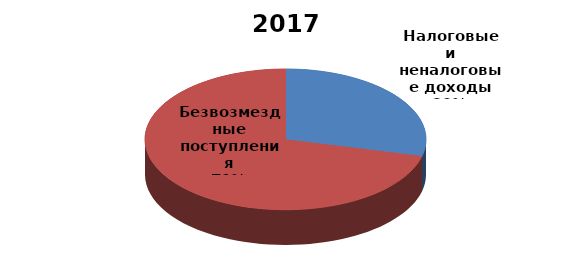
| Category | 2017 год |
|---|---|
| Налоговые и неналоговые доходы | 443642.8 |
| Безвозмездные поступления | 1095344.1 |